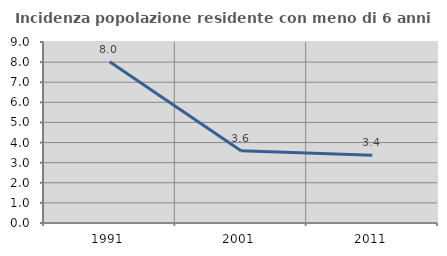
| Category | Incidenza popolazione residente con meno di 6 anni |
|---|---|
| 1991.0 | 8.019 |
| 2001.0 | 3.589 |
| 2011.0 | 3.363 |